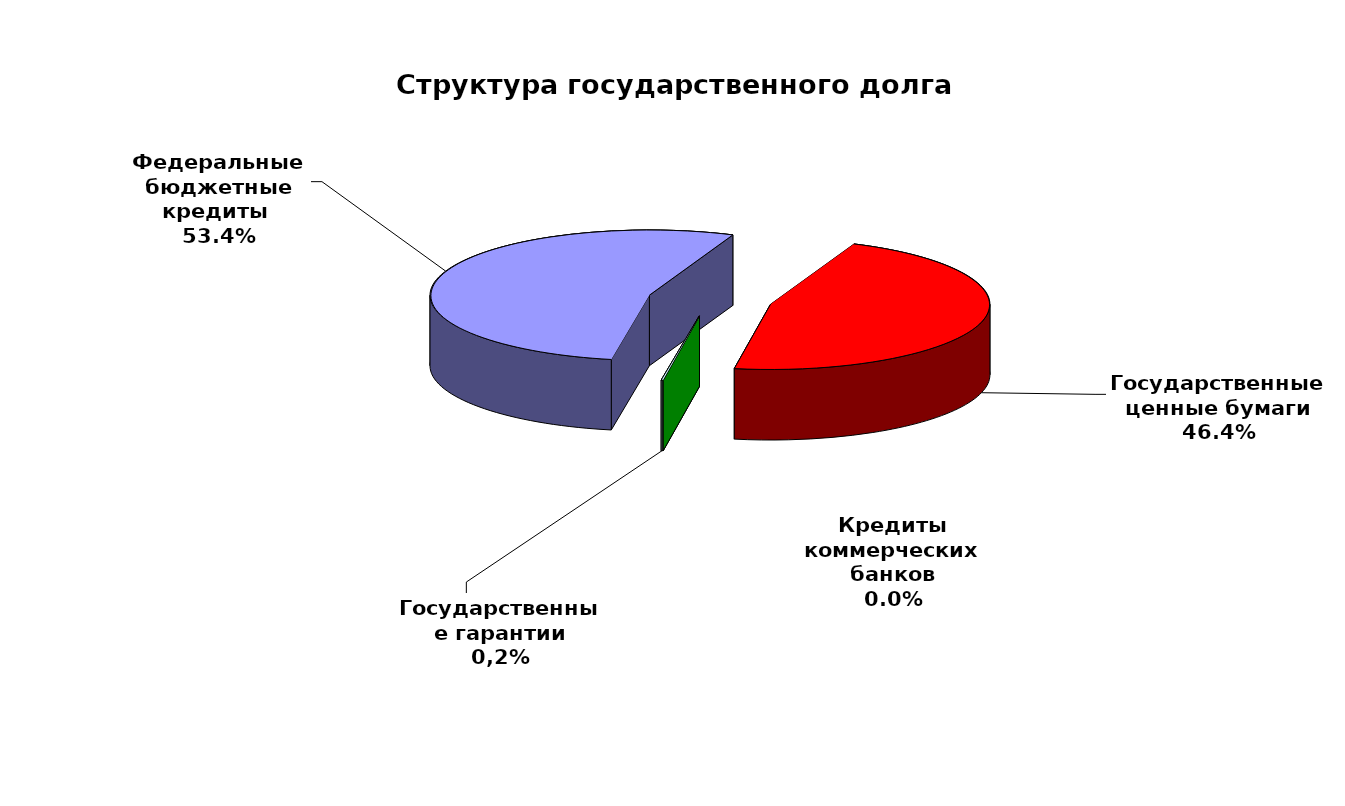
| Category | Series 0 |
|---|---|
| Федеральные бюджетные кредиты  | 55700753.113 |
| Государственные ценные бумаги | 48400000 |
| Кредиты коммерческих банков | 0 |
| Государственные гарантии | 138270.964 |